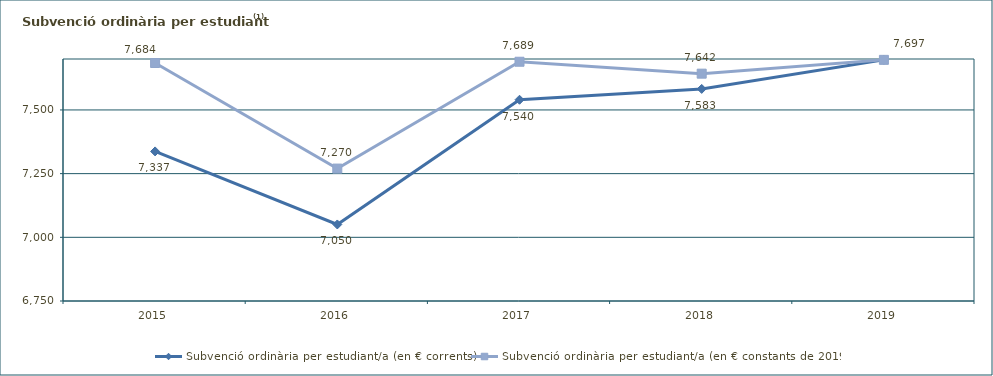
| Category | Subvenció ordinària per estudiant/a (en € corrents) | Subvenció ordinària per estudiant/a (en € constants de 2019) |
|---|---|---|
| 2015.0 | 7337.192 | 7684.252 |
| 2016.0 | 7050.463 | 7269.824 |
| 2017.0 | 7540.023 | 7689.264 |
| 2018.0 | 7582.546 | 7642.448 |
| 2019.0 | 7696.669 | 7696.669 |